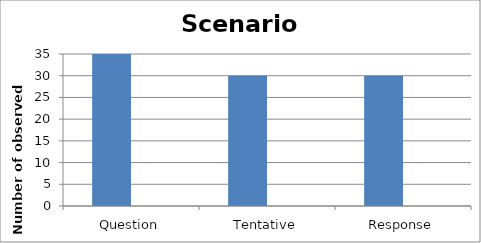
| Category | Series 0 | Series 1 |
|---|---|---|
| Question | 35 | 0 |
| Tentative | 30 | 0 |
| Response | 30 | 0 |